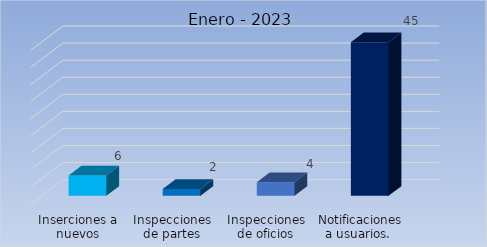
| Category | Cantidad |
|---|---|
| Inserciones a nuevos usuarios | 6 |
| Inspecciones de partes | 2 |
| Inspecciones de oficios | 4 |
| Notificaciones a usuarios.  | 45 |